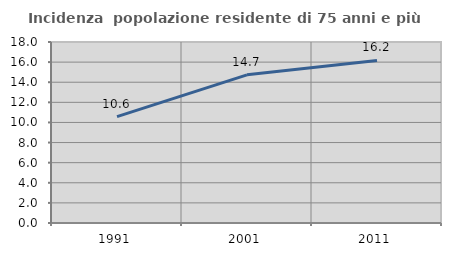
| Category | Incidenza  popolazione residente di 75 anni e più |
|---|---|
| 1991.0 | 10.579 |
| 2001.0 | 14.733 |
| 2011.0 | 16.164 |